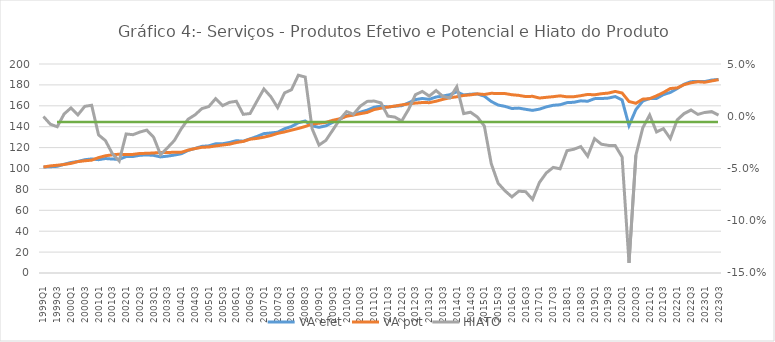
| Category | VA efet | VA pot |
|---|---|---|
| 1999Q1 | 101.412 | 101.437 |
| 1999Q2 | 101.711 | 102.493 |
| 1999Q3 | 102.076 | 103.111 |
| 1999Q4 | 104.046 | 103.82 |
| 2000Q1 | 105.739 | 104.899 |
| 2000Q2 | 106.723 | 106.583 |
| 2000Q3 | 108.418 | 107.4 |
| 2000Q4 | 109.133 | 107.997 |
| 2001Q1 | 108.444 | 110.412 |
| 2001Q2 | 109.54 | 112.153 |
| 2001Q3 | 109.035 | 113.083 |
| 2001Q4 | 108.815 | 113.689 |
| 2002Q1 | 111.399 | 113.319 |
| 2002Q2 | 111.497 | 113.501 |
| 2002Q3 | 112.665 | 114.393 |
| 2002Q4 | 113.002 | 114.521 |
| 2003Q1 | 112.551 | 114.865 |
| 2003Q2 | 111.093 | 115.338 |
| 2003Q3 | 111.815 | 115.294 |
| 2003Q4 | 112.858 | 115.538 |
| 2004Q1 | 114.088 | 115.481 |
| 2004Q2 | 117.279 | 117.613 |
| 2004Q3 | 119.221 | 119.063 |
| 2004Q4 | 121.168 | 120.287 |
| 2005Q1 | 121.689 | 120.572 |
| 2005Q2 | 123.646 | 121.593 |
| 2005Q3 | 123.691 | 122.45 |
| 2005Q4 | 124.888 | 123.248 |
| 2006Q1 | 126.626 | 124.836 |
| 2006Q2 | 126.14 | 125.91 |
| 2006Q3 | 128.372 | 128.034 |
| 2006Q4 | 130.664 | 128.793 |
| 2007Q1 | 133.372 | 129.98 |
| 2007Q2 | 134.012 | 131.543 |
| 2007Q3 | 134.71 | 133.605 |
| 2007Q4 | 138.027 | 135.01 |
| 2008Q1 | 140.165 | 136.697 |
| 2008Q2 | 143.753 | 138.321 |
| 2008Q3 | 145.465 | 140.212 |
| 2008Q4 | 140.852 | 142.547 |
| 2009Q1 | 139.367 | 143.323 |
| 2009Q2 | 140.833 | 144.157 |
| 2009Q3 | 144.18 | 146.116 |
| 2009Q4 | 147.077 | 147.562 |
| 2010Q1 | 150.656 | 149.984 |
| 2010Q2 | 151.477 | 151.195 |
| 2010Q3 | 153.924 | 152.443 |
| 2010Q4 | 155.834 | 153.649 |
| 2011Q1 | 158.667 | 156.392 |
| 2011Q2 | 159.706 | 157.694 |
| 2011Q3 | 158.827 | 158.803 |
| 2011Q4 | 159.6 | 159.724 |
| 2012Q1 | 160.108 | 160.84 |
| 2012Q2 | 162.844 | 161.795 |
| 2012Q3 | 165.932 | 162.576 |
| 2012Q4 | 167.008 | 163.136 |
| 2013Q1 | 166.163 | 163.014 |
| 2013Q2 | 168.418 | 164.377 |
| 2013Q3 | 169.357 | 166.214 |
| 2013Q4 | 170.659 | 167.716 |
| 2014Q1 | 173.394 | 168.64 |
| 2014Q2 | 170.346 | 169.914 |
| 2014Q3 | 171.131 | 170.473 |
| 2014Q4 | 171.3 | 171.435 |
| 2015Q1 | 169.229 | 170.823 |
| 2015Q2 | 164.153 | 171.941 |
| 2015Q3 | 160.755 | 171.76 |
| 2015Q4 | 159.455 | 171.705 |
| 2016Q1 | 157.426 | 170.588 |
| 2016Q2 | 157.789 | 169.977 |
| 2016Q3 | 156.643 | 168.831 |
| 2016Q4 | 155.622 | 169.072 |
| 2017Q1 | 156.825 | 167.43 |
| 2017Q2 | 158.997 | 168.112 |
| 2017Q3 | 160.479 | 168.742 |
| 2017Q4 | 160.996 | 169.522 |
| 2018Q1 | 163.024 | 168.582 |
| 2018Q2 | 163.377 | 168.703 |
| 2018Q3 | 164.752 | 169.677 |
| 2018Q4 | 164.35 | 170.874 |
| 2019Q1 | 166.857 | 170.517 |
| 2019Q2 | 166.961 | 171.555 |
| 2019Q3 | 167.367 | 172.166 |
| 2019Q4 | 168.868 | 173.745 |
| 2020Q1 | 165.52 | 172.248 |
| 2020Q2 | 141.08 | 164.111 |
| 2020Q3 | 156.345 | 162.407 |
| 2020Q4 | 164.54 | 166.384 |
| 2021Q1 | 167.021 | 166.826 |
| 2021Q2 | 167.015 | 169.561 |
| 2021Q3 | 170.719 | 172.763 |
| 2021Q4 | 172.782 | 176.54 |
| 2022Q1 | 176.511 | 177.12 |
| 2022Q2 | 180.674 | 180.219 |
| 2022Q3 | 183.094 | 182.018 |
| 2022Q4 | 183.328 | 183.013 |
| 2023Q1 | 183.211 | 182.538 |
| 2023Q2 | 184.62 | 183.809 |
| 2023Q3 | 185.228 | 185.025 |